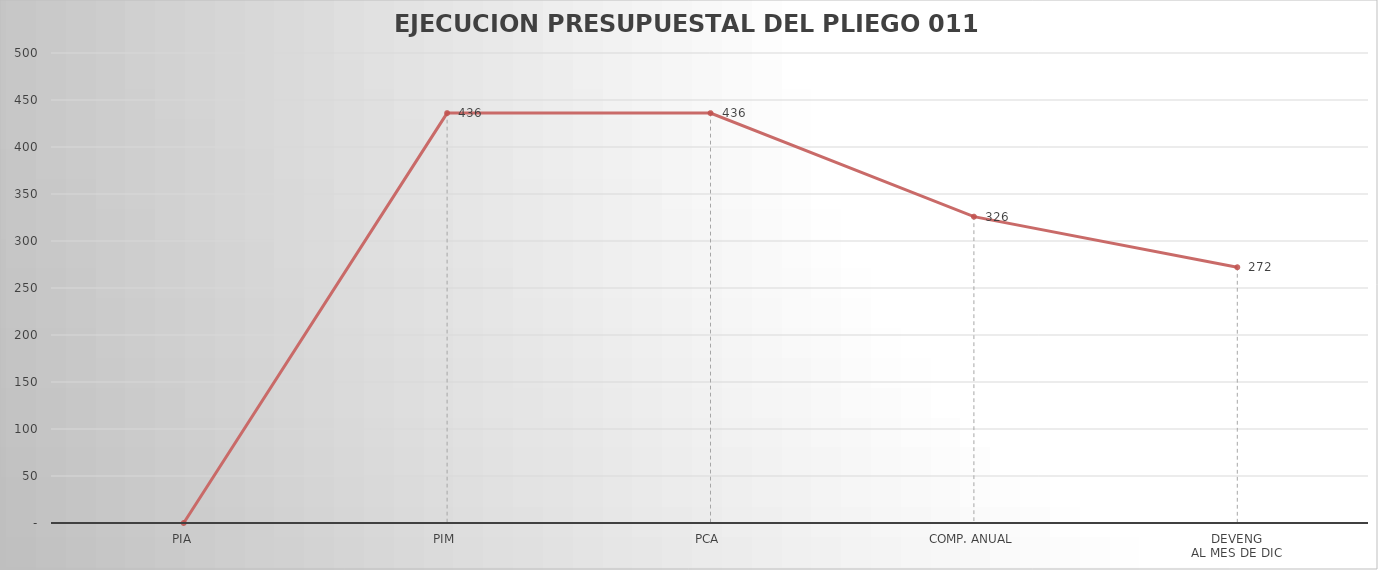
| Category | Series 0 |
|---|---|
| PIA | 0 |
| PIM | 436.059 |
| PCA | 436.059 |
| COMP. ANUAL | 325.875 |
| DEVENG
AL MES DE DIC | 272.075 |